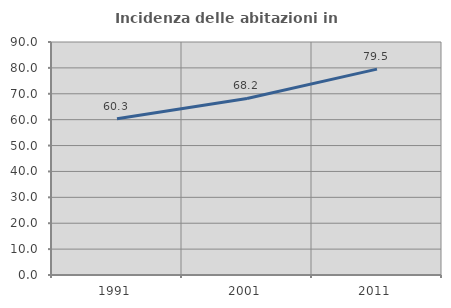
| Category | Incidenza delle abitazioni in proprietà  |
|---|---|
| 1991.0 | 60.338 |
| 2001.0 | 68.199 |
| 2011.0 | 79.526 |